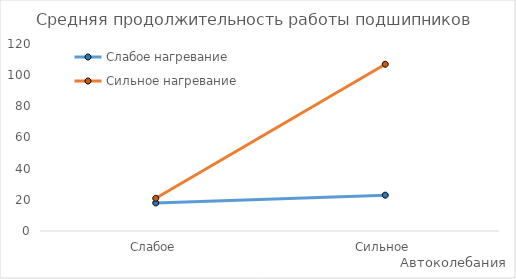
| Category | Слабое нагревание | Сильное нагревание |
|---|---|---|
| Слабое | 18 | 21 |
| Сильное | 23 | 107 |